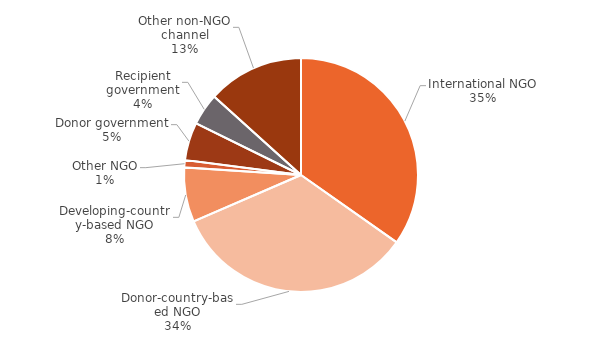
| Category | Share of disability-inclusive aid |
|---|---|
| International NGO | 0.348 |
| Donor-country-based NGO | 0.337 |
| Developing-country-based NGO | 0.075 |
| Other NGO | 0.01 |
| Donor government | 0.052 |
| Recipient government | 0.044 |
| Other non-NGO channel | 0.133 |